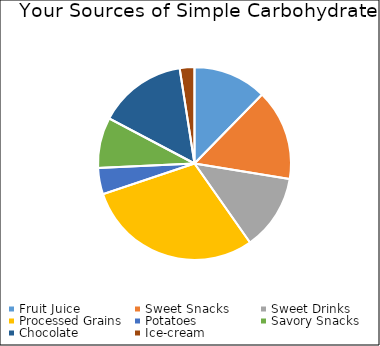
| Category | Series 0 |
|---|---|
| Fruit Juice | 87.5 |
| Sweet Snacks | 108 |
| Sweet Drinks | 90 |
| Processed Grains | 210 |
| Potatoes | 31.25 |
| Savory Snacks | 60 |
| Chocolate | 105 |
| Ice-cream | 17.5 |